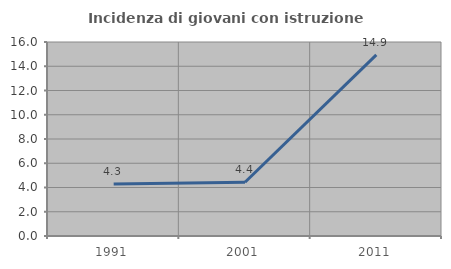
| Category | Incidenza di giovani con istruzione universitaria |
|---|---|
| 1991.0 | 4.286 |
| 2001.0 | 4.43 |
| 2011.0 | 14.943 |